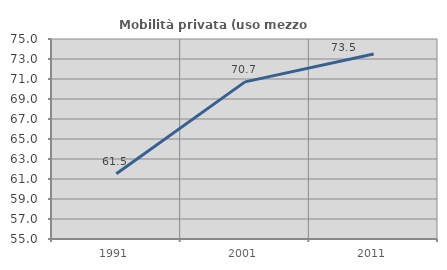
| Category | Mobilità privata (uso mezzo privato) |
|---|---|
| 1991.0 | 61.531 |
| 2001.0 | 70.712 |
| 2011.0 | 73.498 |